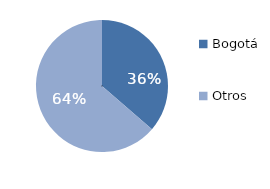
| Category | Series 0 |
|---|---|
| Bogotá | 36.335 |
| Otros | 63.665 |